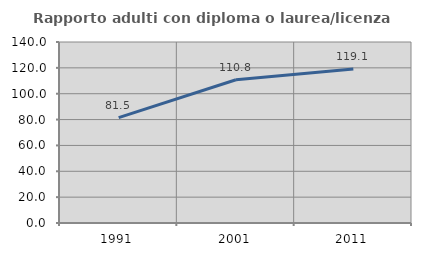
| Category | Rapporto adulti con diploma o laurea/licenza media  |
|---|---|
| 1991.0 | 81.467 |
| 2001.0 | 110.778 |
| 2011.0 | 119.126 |